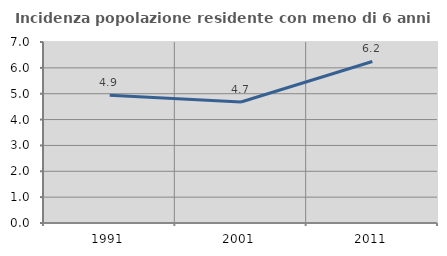
| Category | Incidenza popolazione residente con meno di 6 anni |
|---|---|
| 1991.0 | 4.939 |
| 2001.0 | 4.681 |
| 2011.0 | 6.248 |